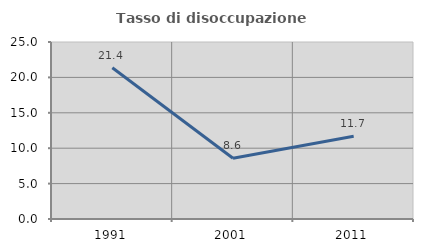
| Category | Tasso di disoccupazione giovanile  |
|---|---|
| 1991.0 | 21.359 |
| 2001.0 | 8.571 |
| 2011.0 | 11.688 |